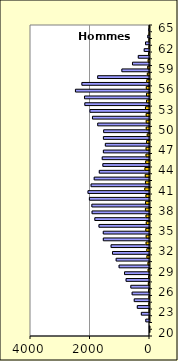
| Category | Hommes |
|---|---|
| 20 | 1 |
| 21 | 0 |
| 22 | 6 |
| 23 | 9 |
| 24 | 18 |
| 25 | 15 |
| 26 | 32 |
| 27 | 39 |
| 28 | 28 |
| 29 | 47 |
| 30 | 52 |
| 31 | 87 |
| 32 | 90 |
| 33 | 115 |
| 34 | 113 |
| 35 | 125 |
| 36 | 109 |
| 37 | 118 |
| 38 | 137 |
| 39 | 133 |
| 40 | 120 |
| 41 | 158 |
| 42 | 136 |
| 43 | 142 |
| 44 | 153 |
| 45 | 128 |
| 46 | 118 |
| 47 | 116 |
| 48 | 99 |
| 49 | 77 |
| 50 | 110 |
| 51 | 111 |
| 52 | 112 |
| 53 | 136 |
| 54 | 100 |
| 55 | 101 |
| 56 | 108 |
| 57 | 93 |
| 58 | 73 |
| 59 | 62 |
| 60 | 47 |
| 61 | 32 |
| 62 | 13 |
| 63 | 15 |
| 64 | 10 |
| 65 | 4 |